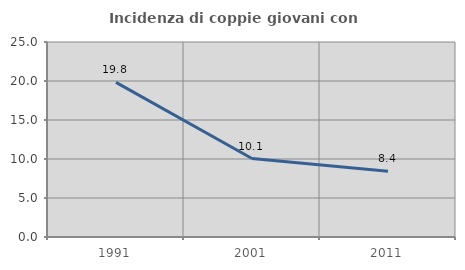
| Category | Incidenza di coppie giovani con figli |
|---|---|
| 1991.0 | 19.827 |
| 2001.0 | 10.06 |
| 2011.0 | 8.429 |